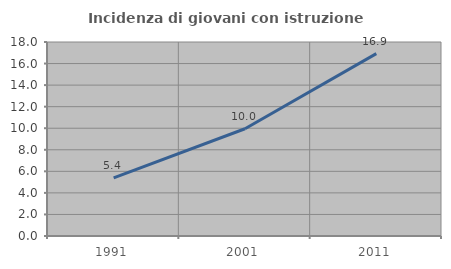
| Category | Incidenza di giovani con istruzione universitaria |
|---|---|
| 1991.0 | 5.386 |
| 2001.0 | 9.953 |
| 2011.0 | 16.917 |